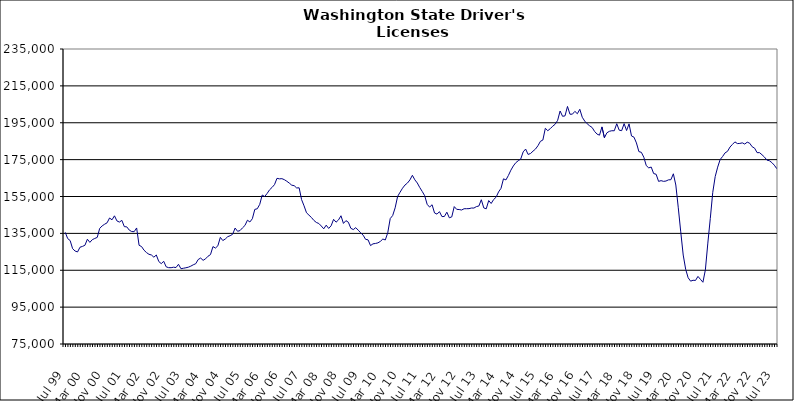
| Category | Series 0 |
|---|---|
| Jul 99 | 135560 |
| Aug 99 | 132182 |
| Sep 99 | 131104 |
| Oct 99 | 126694 |
| Nov 99 | 125425 |
| Dec 99 | 124927 |
| Jan 00 | 127499 |
| Feb 00 | 127927 |
| Mar 00 | 128547 |
| Apr 00 | 131834 |
| May 00 | 130120 |
| Jun 00 | 131595 |
| Jul 00 | 132236 |
| Aug 00 | 132819 |
| Sep 00 | 137711 |
| Oct 00 | 139063 |
| Nov 00 | 139952 |
| Dec 00 | 140732 |
| Jan 01 | 143338 |
| Feb 01 | 142359 |
| Mar 01 | 144523 |
| Apr 01 | 141758 |
| May 01 | 141135 |
| Jun 01 | 142064 |
| Jul 01 | 138646 |
| Aug 01 | 138530 |
| Sep 01 | 136784 |
| Oct 01 | 135996 |
| Nov 01 | 135917 |
| Dec 01 | 137940 |
| Jan 02 | 128531 |
| Feb 02 | 127848 |
| Mar 02 | 125876 |
| Apr 02 | 124595 |
| May 02 | 123660 |
| Jun 02 | 123282 |
| Jul 02 | 122089 |
| Aug 02 | 123279 |
| Sep 02 | 119727 |
| Oct 02 | 118588 |
| Nov 02 | 119854 |
| Dec 02 | 116851 |
| Jan 03 | 116407 |
| Feb 03 | 116382 |
| Mar 03 | 116648 |
| Apr 03 | 116471 |
| May 03 | 118231 |
| Jun 03 | 115831 |
| Jul 03 | 116082 |
| Aug 03 | 116341 |
| Sep 03 | 116653 |
| Oct 03 | 117212 |
| Nov 03 | 117962 |
| Dec 03 | 118542 |
| Jan 04 | 120817 |
| Feb 04 | 121617 |
| Mar 04 | 120369 |
| Apr 04 | 121200 |
| May 04 | 122609 |
| Jun 04 | 123484 |
| Jul 04 | 127844 |
| Aug 04 | 127025 |
| Sep 04 | 128273 |
| Oct 04 | 132853 |
| Nov 04 | 131106 |
| Dec 04 | 131935 |
| Jan 05 | 133205 |
| Feb 05 | 133736 |
| Mar 05 | 134528 |
| Apr 05 | 137889 |
| May 05 | 136130 |
| Jun 05 | 136523 |
| Jul 05 | 137997 |
| Aug 05 | 139294 |
| Sep 05 | 142140 |
| Oct 05 | 141192 |
| Nov 05 | 142937 |
| Dec 05 | 148013 |
| Jan 06 | 148341 |
| Feb 06 | 150744 |
| Mar 06 | 155794 |
| Apr 06 | 154984 |
| May 06 | 156651 |
| Jun 06 | 158638 |
| Jul 06 | 159911 |
| Aug 06 | 161445 |
| Sep 06 | 164852 |
| Oct 06 | 164570 |
| Nov 06 | 164679 |
| Dec 06 | 164127 |
| Jan 07 | 163271 |
| Feb 07 | 162273 |
| Mar 07 | 161140 |
| Apr 07 | 160860 |
| May 07 | 159633 |
| Jun 07 | 159724 |
| Jul 07 | 153303 |
| Aug 07 | 149939 |
| Sep 07 | 146172 |
| Oct 07 | 144876 |
| Nov 07 | 143613 |
| Dec 07 | 142022 |
| Jan 08 | 140909 |
| Feb 08 | 140368 |
| Mar 08 | 138998 |
| Apr 08 | 137471 |
| May 08 | 139453 |
| Jun 08 | 137680 |
| Jul 08 | 139120 |
| Aug 08 | 142612 |
| Sep-08 | 141071 |
| Oct 08 | 142313 |
| Nov 08 | 144556 |
| Dec 08 | 140394 |
| Jan 09 | 141903 |
| Feb 09 | 141036 |
| Mar 09 | 137751 |
| Apr 09 | 137060 |
| May 09 | 138101 |
| Jun 09 | 136739 |
| Jul 09 | 135317 |
| Aug 09 | 134020 |
| Sep 09 | 131756 |
| Oct 09 | 131488 |
| Nov 09 | 128370 |
| Dec 09 | 129323 |
| Jan 10 | 129531 |
| Feb 10 | 129848 |
| Mar 10 | 130654 |
| Apr 10 | 131929 |
| May 10 | 131429 |
| Jun 10 | 135357 |
| Jul 10 | 143032 |
| Aug 10 | 144686 |
| Sep 10 | 148856 |
| Oct 10 | 155042 |
| Nov 10 | 157328 |
| Dec 10 | 159501 |
| Jan 11 | 161221 |
| Feb 11 | 162312 |
| Mar 11 | 163996 |
| Apr 11 | 166495 |
| May 11 | 164040 |
| Jun 11 | 162324 |
| Jul 11 | 159862 |
| Aug 11 | 157738 |
| Sep 11 | 155430 |
| Oct 11 | 150762 |
| Nov 11 | 149255 |
| Dec 11 | 150533 |
| Jan 12 | 146068 |
| Feb 12 | 145446 |
| Mar 12 | 146788 |
| Apr 12 | 144110 |
| May 12 | 144162 |
| Jun 12 | 146482 |
| Jul 12 | 143445 |
| Aug 12 | 143950 |
| Sep 12 | 149520 |
| Oct 12 | 148033 |
| Nov 12 | 147926 |
| Dec 12 | 147674 |
| Jan 13 | 148360 |
| Feb-13 | 148388 |
| Mar-13 | 148414 |
| Apr 13 | 148749 |
| May 13 | 148735 |
| Jun-13 | 149521 |
| Jul 13 | 149837 |
| Aug 13 | 153252 |
| Sep 13 | 148803 |
| Oct 13 | 148315 |
| Nov 13 | 152804 |
| Dec 13 | 151209 |
| Jan 14 | 153357 |
| Feb-14 | 154608 |
| Mar 14 | 157479 |
| Apr 14 | 159441 |
| May 14 | 164591 |
| Jun 14 | 163995 |
| Jul-14 | 166411 |
| Aug-14 | 169272 |
| Sep 14 | 171565 |
| Oct 14 | 173335 |
| Nov 14 | 174406 |
| Dec 14 | 175302 |
| Jan 15 | 179204 |
| Feb 15 | 180737 |
| Mar 15 | 177810 |
| Apr-15 | 178331 |
| May 15 | 179601 |
| Jun-15 | 180729 |
| Jul 15 | 182540 |
| Aug 15 | 184924 |
| Sep 15 | 185620 |
| Oct 15 | 192002 |
| Nov 15 | 190681 |
| Dec 15 | 191795 |
| Jan 16 | 193132 |
| Feb 16 | 194206 |
| Mar 16 | 196319 |
| Apr 16 | 201373 |
| May 16 | 198500 |
| Jun 16 | 198743 |
| Jul 16 | 203841 |
| Aug 16 | 199630 |
| Sep 16 | 199655 |
| Oct 16 | 201181 |
| Nov 16 | 199888 |
| Dec 16 | 202304 |
| Jan 17 | 197977 |
| Feb 17 | 195889 |
| Mar 17 | 194438 |
| Apr 17 | 193335 |
| May 17 | 192430 |
| Jun 17 | 190298 |
| Jul 17 | 188832 |
| Aug 17 | 188264 |
| Sep 17 | 192738 |
| Oct 17 | 186856 |
| Nov 17 | 189537 |
| Dec 17 | 190341 |
| Jan 18 | 190670 |
| Feb 18 | 190645 |
| Mar 18 | 194476 |
| Apr 18 | 190971 |
| May 18 | 190707 |
| Jun 18 | 194516 |
| Jul 18 | 190783 |
| Aug 18 | 194390 |
| Sep 18 | 187831 |
| Oct 18 | 187188 |
| Nov 18 | 184054 |
| Dec 18 | 179347 |
| Jan 19 | 178958 |
| Feb 19 | 176289 |
| Mar 19 | 171747 |
| Apr 19 | 170532 |
| May 19 | 170967 |
| Jun 19 | 167444 |
| Jul 19 | 167059 |
| Aug 19 | 163194 |
| Sep 19 | 163599 |
| Oct 19 | 163212 |
| Nov 19 | 163388 |
| Dec 19 | 164024 |
| Jan 20 | 164114 |
| Feb 20 | 167320 |
| Mar 20 | 161221 |
| Apr 20 | 148866 |
| May 20 | 135821 |
| Jun 20 | 123252 |
| Jul 20 | 115526 |
| Aug 20 | 110940 |
| Sep 20 | 109099 |
| Oct 20 | 109566 |
| Nov 20 | 109488 |
| Dec 20 | 111658 |
| Jan 21 | 110070 |
| Feb 21 | 108491 |
| Mar 21 | 115176 |
| Apr 21 | 129726 |
| May 21 | 143052 |
| Jun 21 | 157253 |
| Jul 21 | 165832 |
| Aug 21 | 170937 |
| Sep 21 | 175042 |
| Oct 21 | 176696 |
| Nov 21 | 178677 |
| Dec 21 | 179501 |
| Jan 22 | 181825 |
| Feb 22 | 183258 |
| Mar 22 | 184618 |
| Apr 22 | 183710 |
| May 22 | 183784 |
| Jun 22 | 184101 |
| Jul 22 | 183443 |
| Aug 22 | 184475 |
| Sep 22 | 183902 |
| Oct 22 | 181994 |
| Nov 22 | 181207 |
| Dec 22 | 178793 |
| Jan 23 | 178782 |
| Feb 23 | 177647 |
| Mar 23 | 176386 |
| Apr 23 | 174729 |
| May 23 | 174390 |
| Jun 23 | 173391 |
| Jul 23 | 171988 |
| Aug 23 | 170100 |